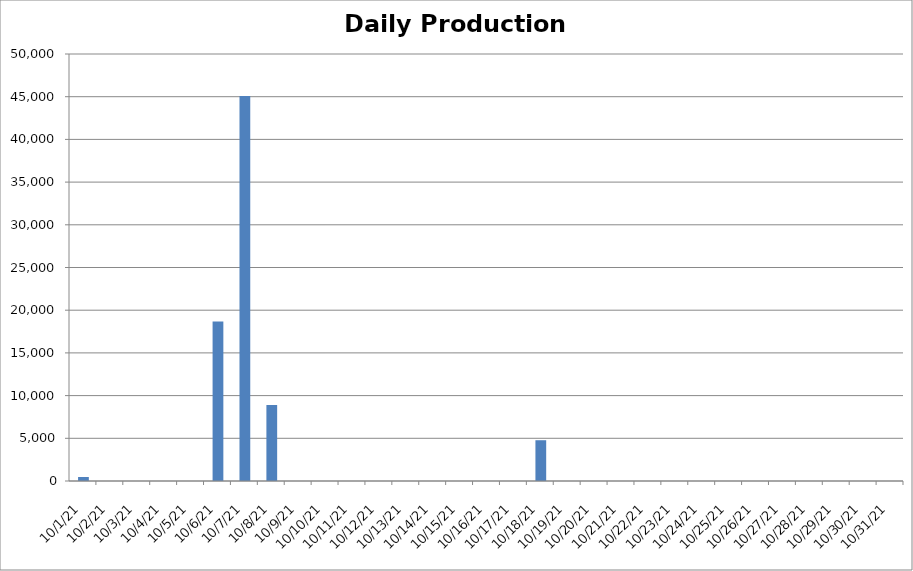
| Category | Cogen Daily Production (kWh) |
|---|---|
| 10/1/21 | 470 |
| 10/2/21 | 0 |
| 10/3/21 | 0 |
| 10/4/21 | 0 |
| 10/5/21 | 0 |
| 10/6/21 | 18663.25 |
| 10/7/21 | 45069.5 |
| 10/8/21 | 8897.5 |
| 10/9/21 | 0 |
| 10/10/21 | 0 |
| 10/11/21 | 0 |
| 10/12/21 | 0 |
| 10/13/21 | 0 |
| 10/14/21 | 0 |
| 10/15/21 | 0 |
| 10/16/21 | 0 |
| 10/17/21 | 0 |
| 10/18/21 | 4774.75 |
| 10/19/21 | 0 |
| 10/20/21 | 0 |
| 10/21/21 | 0 |
| 10/22/21 | 0 |
| 10/23/21 | 0 |
| 10/24/21 | 0 |
| 10/25/21 | 0 |
| 10/26/21 | 0 |
| 10/27/21 | 0 |
| 10/28/21 | 0 |
| 10/29/21 | 0 |
| 10/30/21 | 0 |
| 10/31/21 | 0 |